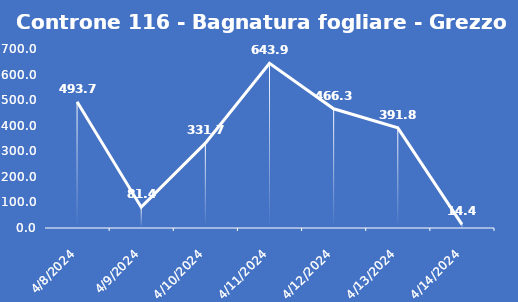
| Category | Controne 116 - Bagnatura fogliare - Grezzo (min) |
|---|---|
| 4/8/24 | 493.7 |
| 4/9/24 | 81.4 |
| 4/10/24 | 331.7 |
| 4/11/24 | 643.9 |
| 4/12/24 | 466.3 |
| 4/13/24 | 391.8 |
| 4/14/24 | 14.4 |